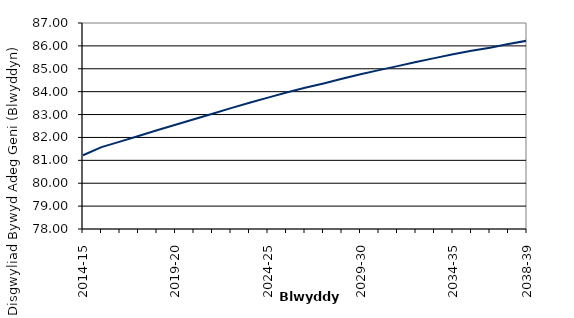
| Category | EOLB |
|---|---|
| 2014-15 | 81.223 |
|  | 81.576 |
|  | 81.818 |
|  | 82.064 |
|  | 82.316 |
| 2019-20 | 82.552 |
|  | 82.796 |
|  | 83.032 |
|  | 83.281 |
|  | 83.513 |
| 2024-25 | 83.739 |
|  | 83.965 |
|  | 84.17 |
|  | 84.361 |
|  | 84.566 |
| 2029-30 | 84.758 |
|  | 84.942 |
|  | 85.115 |
|  | 85.295 |
|  | 85.466 |
| 2034-35 | 85.632 |
|  | 85.785 |
|  | 85.917 |
|  | 86.083 |
| 2038-39 | 86.227 |